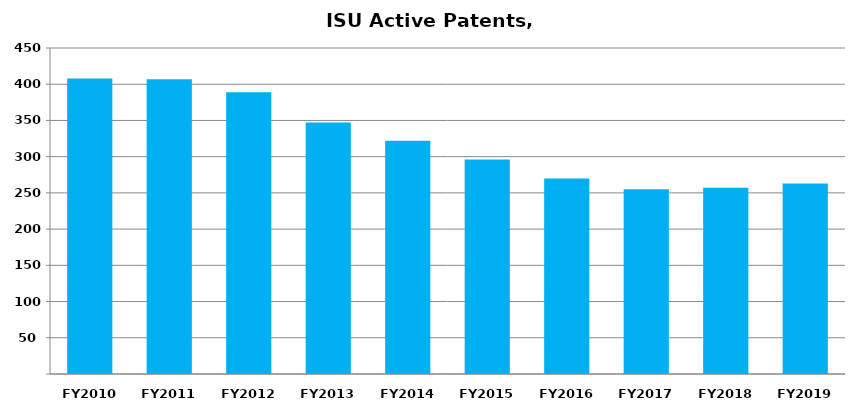
| Category | Active Patents |
|---|---|
| FY2010 | 408 |
| FY2011 | 407 |
| FY2012 | 389 |
| FY2013 | 347 |
| FY2014 | 322 |
| FY2015 | 296 |
| FY2016 | 270 |
| FY2017 | 255 |
| FY2018 | 257 |
| FY2019 | 263 |